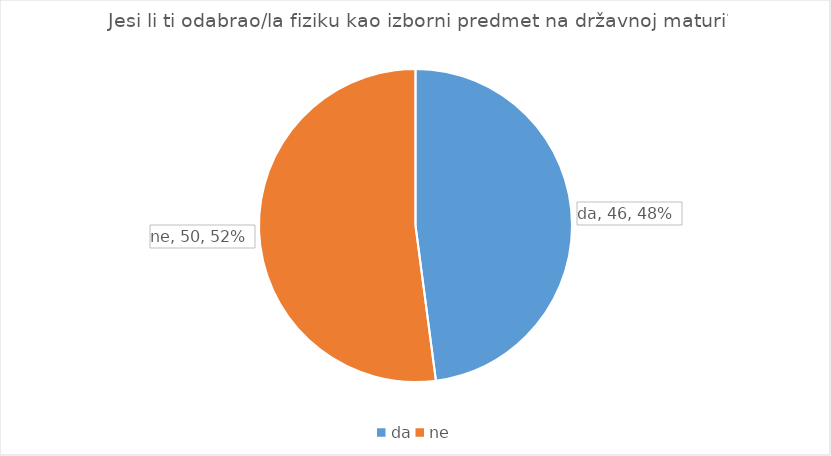
| Category | Series 0 |
|---|---|
| da | 46 |
| ne | 50 |